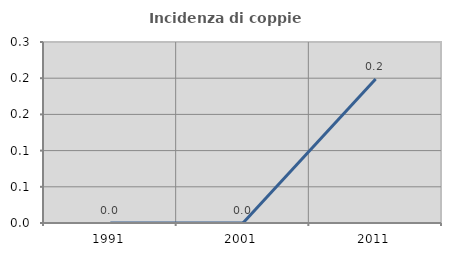
| Category | Incidenza di coppie miste |
|---|---|
| 1991.0 | 0 |
| 2001.0 | 0 |
| 2011.0 | 0.199 |